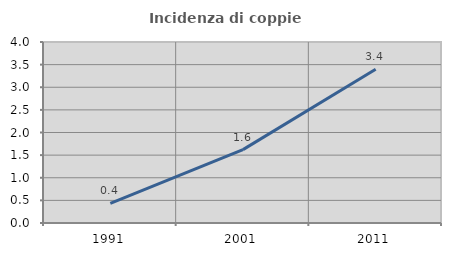
| Category | Incidenza di coppie miste |
|---|---|
| 1991.0 | 0.433 |
| 2001.0 | 1.621 |
| 2011.0 | 3.399 |